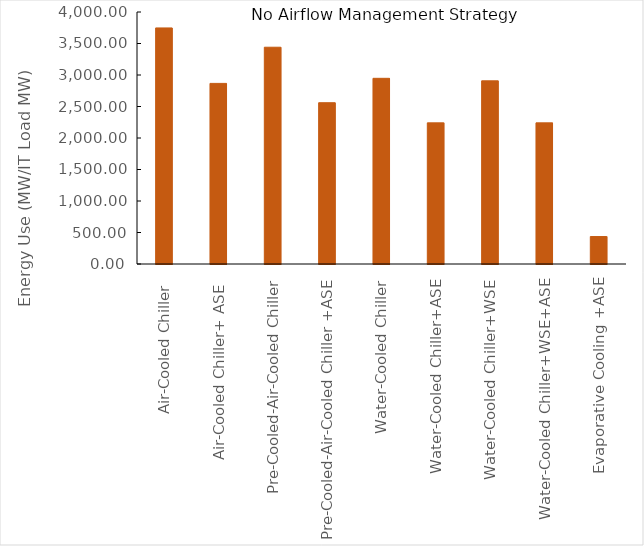
| Category | Series 0 |
|---|---|
| Air-Cooled Chiller  | 3747.04 |
| Air-Cooled Chiller+ ASE  | 2866.766 |
| Pre-Cooled-Air-Cooled Chiller | 3440.87 |
| Pre-Cooled-Air-Cooled Chiller +ASE | 2560.072 |
| Water-Cooled Chiller | 2947.35 |
| Water-Cooled Chiller+ASE | 2240.29 |
| Water-Cooled Chiller+WSE | 2907.27 |
| Water-Cooled Chiller+WSE+ASE | 2240.29 |
| Evaporative Cooling +ASE | 435.91 |